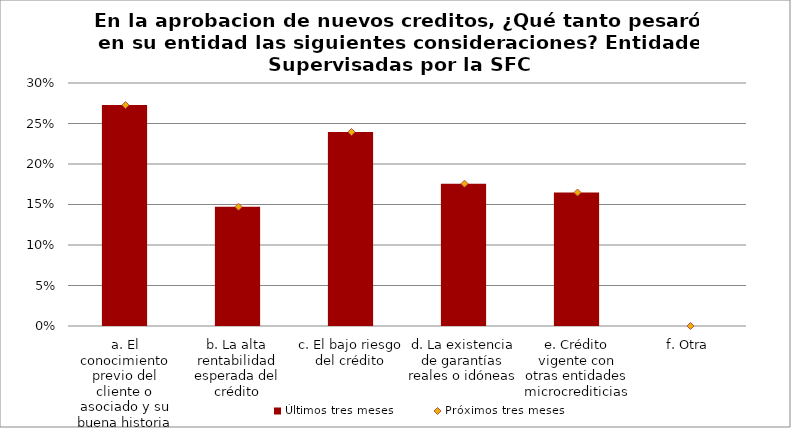
| Category | Últimos tres meses |
|---|---|
| a. El conocimiento previo del cliente o asociado y su buena historia de crédito | 0.273 |
| b. La alta rentabilidad esperada del crédito | 0.147 |
| c. El bajo riesgo del crédito | 0.24 |
| d. La existencia de garantías reales o idóneas | 0.176 |
| e. Crédito vigente con otras entidades microcrediticias | 0.165 |
| f. Otra | 0 |